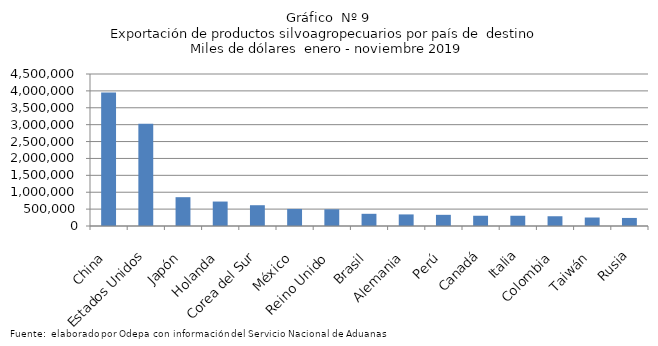
| Category | Series 0 |
|---|---|
| China | 3950656.425 |
| Estados Unidos | 3026617.979 |
| Japón | 853205.037 |
| Holanda | 723828.925 |
| Corea del Sur | 615093.545 |
| México | 505445.914 |
| Reino Unido | 495015.251 |
| Brasil | 361004.381 |
| Alemania | 342899.614 |
| Perú | 330699.078 |
| Canadá | 303476.473 |
| Italia | 303327.731 |
| Colombia | 288782.125 |
| Taiwán | 251329.823 |
| Rusia | 238598.712 |